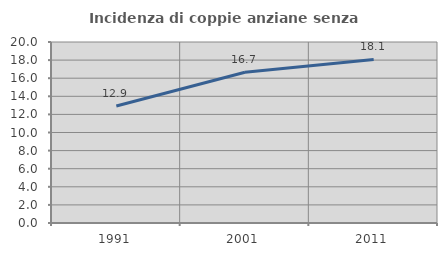
| Category | Incidenza di coppie anziane senza figli  |
|---|---|
| 1991.0 | 12.921 |
| 2001.0 | 16.657 |
| 2011.0 | 18.077 |